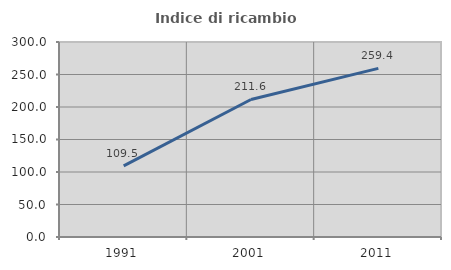
| Category | Indice di ricambio occupazionale  |
|---|---|
| 1991.0 | 109.535 |
| 2001.0 | 211.55 |
| 2011.0 | 259.396 |